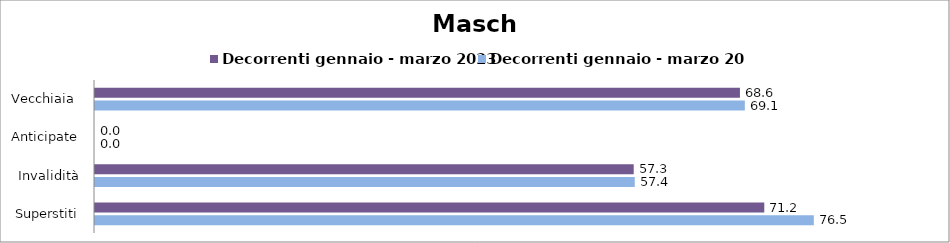
| Category | Decorrenti gennaio - marzo 2023 | Decorrenti gennaio - marzo 2024 |
|---|---|---|
| Vecchiaia  | 68.61 | 69.13 |
| Anticipate | 0 | 0 |
| Invalidità | 57.31 | 57.42 |
| Superstiti | 71.2 | 76.47 |